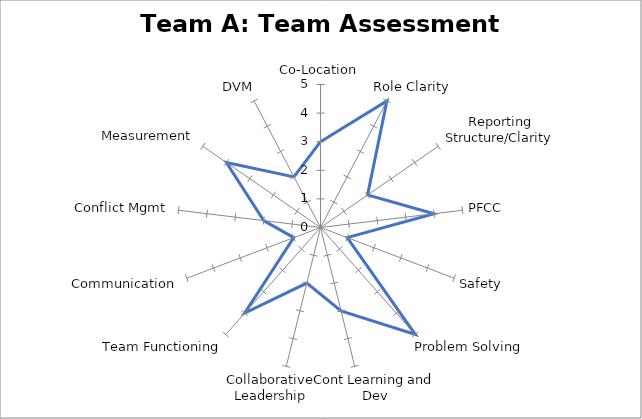
| Category | Series 0 |
|---|---|
| Co-Location | 3 |
| Role Clarity | 5 |
| Reporting Structure/Clarity | 2 |
| PFCC | 4 |
| Safety | 1 |
| Problem Solving | 5 |
| Cont Learning and Dev | 3 |
| Collaborative Leadership | 2 |
| Team Functioning | 4 |
| Communication | 1 |
| Conflict Mgmt | 2 |
| Measurement | 4 |
| DVM | 2 |